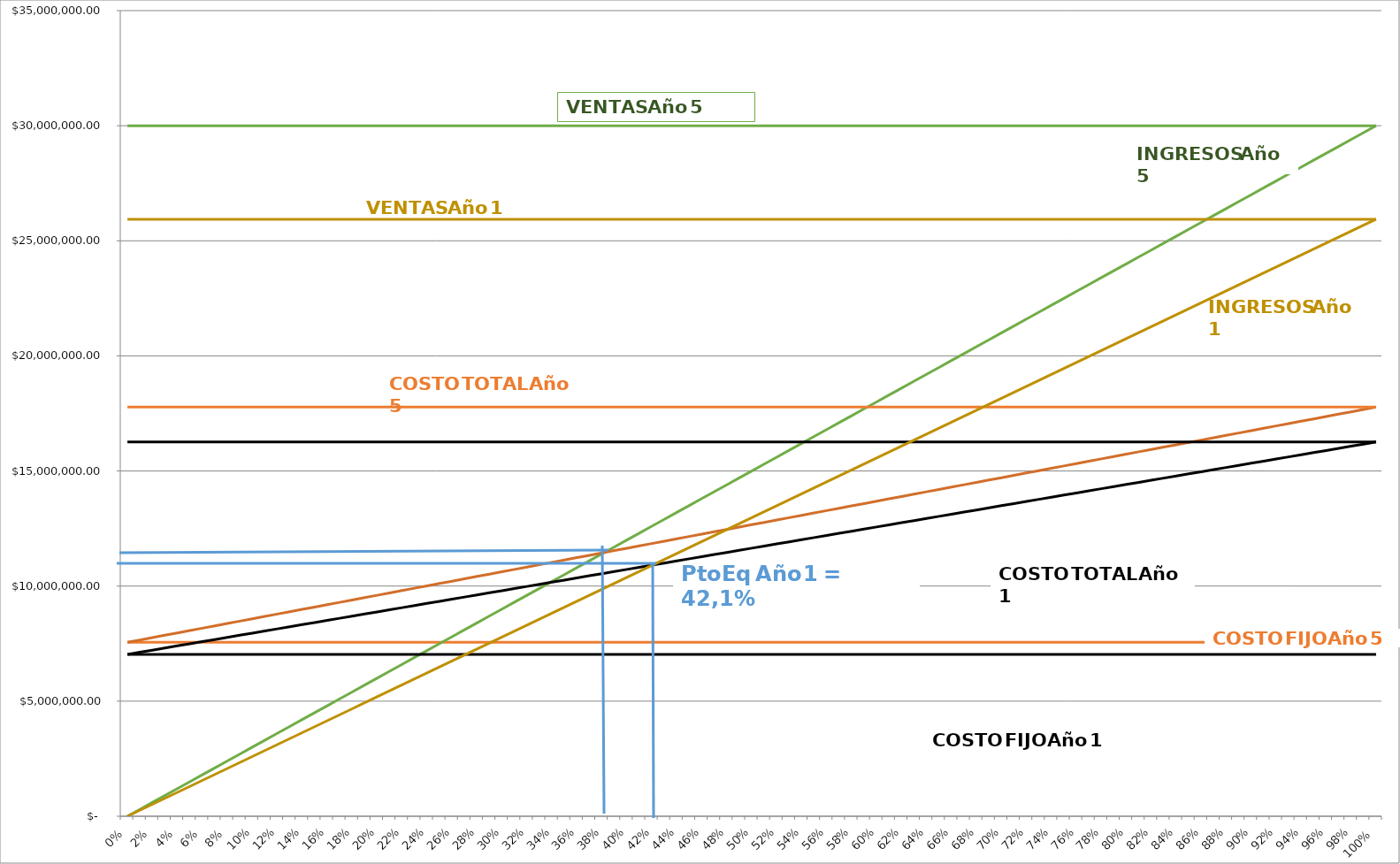
| Category | Ventas Año 5 | CFT Año 5 | Ing Año 5 | CV Año 5 | CT Año 5 | Ventas Año 1 | CFT Año 1 | CV Año 1 | CT Año 1 | Ing Año 1 |
|---|---|---|---|---|---|---|---|---|---|---|
| 0.0 | 30000000 | 7556679.2 | 0 | 7556679.2 | 17773897.792 | 25937500 | 7032367.523 | 7032367.523 | 16259117.051 | 0 |
| 0.01 | 30000000 | 7556679.2 | 300000 | 7658851.386 | 17773897.792 | 25937500 | 7032367.523 | 7124635.019 | 16259117.051 | 259375 |
| 0.02 | 30000000 | 7556679.2 | 600000 | 7761023.572 | 17773897.792 | 25937500 | 7032367.523 | 7216902.514 | 16259117.051 | 518750 |
| 0.03 | 30000000 | 7556679.2 | 900000 | 7863195.758 | 17773897.792 | 25937500 | 7032367.523 | 7309170.009 | 16259117.051 | 778125 |
| 0.04 | 30000000 | 7556679.2 | 1200000 | 7965367.944 | 17773897.792 | 25937500 | 7032367.523 | 7401437.504 | 16259117.051 | 1037500 |
| 0.05 | 30000000 | 7556679.2 | 1500000 | 8067540.13 | 17773897.792 | 25937500 | 7032367.523 | 7493705 | 16259117.051 | 1296875 |
| 0.06 | 30000000 | 7556679.2 | 1800000 | 8169712.316 | 17773897.792 | 25937500 | 7032367.523 | 7585972.495 | 16259117.051 | 1556250 |
| 0.07 | 30000000 | 7556679.2 | 2100000 | 8271884.502 | 17773897.792 | 25937500 | 7032367.523 | 7678239.99 | 16259117.051 | 1815625 |
| 0.08 | 30000000 | 7556679.2 | 2400000 | 8374056.688 | 17773897.792 | 25937500 | 7032367.523 | 7770507.486 | 16259117.051 | 2075000 |
| 0.09 | 30000000 | 7556679.2 | 2700000 | 8476228.874 | 17773897.792 | 25937500 | 7032367.523 | 7862774.981 | 16259117.051 | 2334375 |
| 0.1 | 30000000 | 7556679.2 | 3000000 | 8578401.059 | 17773897.792 | 25937500 | 7032367.523 | 7955042.476 | 16259117.051 | 2593750 |
| 0.11 | 30000000 | 7556679.2 | 3300000 | 8680573.245 | 17773897.792 | 25937500 | 7032367.523 | 8047309.971 | 16259117.051 | 2853125 |
| 0.12 | 30000000 | 7556679.2 | 3600000 | 8782745.431 | 17773897.792 | 25937500 | 7032367.523 | 8139577.467 | 16259117.051 | 3112500 |
| 0.13 | 30000000 | 7556679.2 | 3900000 | 8884917.617 | 17773897.792 | 25937500 | 7032367.523 | 8231844.962 | 16259117.051 | 3371875 |
| 0.14 | 30000000 | 7556679.2 | 4200000 | 8987089.803 | 17773897.792 | 25937500 | 7032367.523 | 8324112.457 | 16259117.051 | 3631250 |
| 0.15 | 30000000 | 7556679.2 | 4500000 | 9089261.989 | 17773897.792 | 25937500 | 7032367.523 | 8416379.952 | 16259117.051 | 3890625 |
| 0.16 | 30000000 | 7556679.2 | 4800000 | 9191434.175 | 17773897.792 | 25937500 | 7032367.523 | 8508647.448 | 16259117.051 | 4150000 |
| 0.17 | 30000000 | 7556679.2 | 5100000 | 9293606.361 | 17773897.792 | 25937500 | 7032367.523 | 8600914.943 | 16259117.051 | 4409375 |
| 0.18 | 30000000 | 7556679.2 | 5400000 | 9395778.547 | 17773897.792 | 25937500 | 7032367.523 | 8693182.438 | 16259117.051 | 4668750 |
| 0.19 | 30000000 | 7556679.2 | 5700000 | 9497950.733 | 17773897.792 | 25937500 | 7032367.523 | 8785449.934 | 16259117.051 | 4928125 |
| 0.2 | 30000000 | 7556679.2 | 6000000 | 9600122.919 | 17773897.792 | 25937500 | 7032367.523 | 8877717.429 | 16259117.051 | 5187500 |
| 0.21 | 30000000 | 7556679.2 | 6300000 | 9702295.105 | 17773897.792 | 25937500 | 7032367.523 | 8969984.924 | 16259117.051 | 5446875 |
| 0.22 | 30000000 | 7556679.2 | 6600000 | 9804467.291 | 17773897.792 | 25937500 | 7032367.523 | 9062252.419 | 16259117.051 | 5706250 |
| 0.23 | 30000000 | 7556679.2 | 6900000 | 9906639.476 | 17773897.792 | 25937500 | 7032367.523 | 9154519.915 | 16259117.051 | 5965625 |
| 0.24 | 30000000 | 7556679.2 | 7200000 | 10008811.662 | 17773897.792 | 25937500 | 7032367.523 | 9246787.41 | 16259117.051 | 6225000 |
| 0.25 | 30000000 | 7556679.2 | 7500000 | 10110983.848 | 17773897.792 | 25937500 | 7032367.523 | 9339054.905 | 16259117.051 | 6484375 |
| 0.26 | 30000000 | 7556679.2 | 7800000 | 10213156.034 | 17773897.792 | 25937500 | 7032367.523 | 9431322.401 | 16259117.051 | 6743750 |
| 0.27 | 30000000 | 7556679.2 | 8100000 | 10315328.22 | 17773897.792 | 25937500 | 7032367.523 | 9523589.896 | 16259117.051 | 7003125 |
| 0.28 | 30000000 | 7556679.2 | 8400000 | 10417500.406 | 17773897.792 | 25937500 | 7032367.523 | 9615857.391 | 16259117.051 | 7262500 |
| 0.29 | 30000000 | 7556679.2 | 8700000 | 10519672.592 | 17773897.792 | 25937500 | 7032367.523 | 9708124.886 | 16259117.051 | 7521875 |
| 0.3 | 30000000 | 7556679.2 | 9000000 | 10621844.778 | 17773897.792 | 25937500 | 7032367.523 | 9800392.382 | 16259117.051 | 7781250 |
| 0.31 | 30000000 | 7556679.2 | 9300000 | 10724016.964 | 17773897.792 | 25937500 | 7032367.523 | 9892659.877 | 16259117.051 | 8040625 |
| 0.32 | 30000000 | 7556679.2 | 9600000 | 10826189.15 | 17773897.792 | 25937500 | 7032367.523 | 9984927.372 | 16259117.051 | 8300000 |
| 0.33 | 30000000 | 7556679.2 | 9900000 | 10928361.336 | 17773897.792 | 25937500 | 7032367.523 | 10077194.867 | 16259117.051 | 8559375 |
| 0.34 | 30000000 | 7556679.2 | 10200000 | 11030533.522 | 17773897.792 | 25937500 | 7032367.523 | 10169462.363 | 16259117.051 | 8818750 |
| 0.35 | 30000000 | 7556679.2 | 10500000 | 11132705.707 | 17773897.792 | 25937500 | 7032367.523 | 10261729.858 | 16259117.051 | 9078125 |
| 0.36 | 30000000 | 7556679.2 | 10800000 | 11234877.893 | 17773897.792 | 25937500 | 7032367.523 | 10353997.353 | 16259117.051 | 9337500 |
| 0.37 | 30000000 | 7556679.2 | 11100000 | 11337050.079 | 17773897.792 | 25937500 | 7032367.523 | 10446264.849 | 16259117.051 | 9596875 |
| 0.38 | 30000000 | 7556679.2 | 11400000 | 11439222.265 | 17773897.792 | 25937500 | 7032367.523 | 10538532.344 | 16259117.051 | 9856250 |
| 0.39 | 30000000 | 7556679.2 | 11700000 | 11541394.451 | 17773897.792 | 25937500 | 7032367.523 | 10630799.839 | 16259117.051 | 10115625 |
| 0.4 | 30000000 | 7556679.2 | 12000000 | 11643566.637 | 17773897.792 | 25937500 | 7032367.523 | 10723067.334 | 16259117.051 | 10375000 |
| 0.41 | 30000000 | 7556679.2 | 12300000 | 11745738.823 | 17773897.792 | 25937500 | 7032367.523 | 10815334.83 | 16259117.051 | 10634375 |
| 0.42 | 30000000 | 7556679.2 | 12600000 | 11847911.009 | 17773897.792 | 25937500 | 7032367.523 | 10907602.325 | 16259117.051 | 10893750 |
| 0.43 | 30000000 | 7556679.2 | 12900000 | 11950083.195 | 17773897.792 | 25937500 | 7032367.523 | 10999869.82 | 16259117.051 | 11153125 |
| 0.44 | 30000000 | 7556679.2 | 13200000 | 12052255.381 | 17773897.792 | 25937500 | 7032367.523 | 11092137.316 | 16259117.051 | 11412500 |
| 0.45 | 30000000 | 7556679.2 | 13500000 | 12154427.567 | 17773897.792 | 25937500 | 7032367.523 | 11184404.811 | 16259117.051 | 11671875 |
| 0.46 | 30000000 | 7556679.2 | 13800000 | 12256599.753 | 17773897.792 | 25937500 | 7032367.523 | 11276672.306 | 16259117.051 | 11931250 |
| 0.47 | 30000000 | 7556679.2 | 14100000 | 12358771.939 | 17773897.792 | 25937500 | 7032367.523 | 11368939.801 | 16259117.051 | 12190625 |
| 0.48 | 30000000 | 7556679.2 | 14400000 | 12460944.124 | 17773897.792 | 25937500 | 7032367.523 | 11461207.297 | 16259117.051 | 12450000 |
| 0.49 | 30000000 | 7556679.2 | 14700000 | 12563116.31 | 17773897.792 | 25937500 | 7032367.523 | 11553474.792 | 16259117.051 | 12709375 |
| 0.5 | 30000000 | 7556679.2 | 15000000 | 12665288.496 | 17773897.792 | 25937500 | 7032367.523 | 11645742.287 | 16259117.051 | 12968750 |
| 0.51 | 30000000 | 7556679.2 | 15300000 | 12767460.682 | 17773897.792 | 25937500 | 7032367.523 | 11738009.782 | 16259117.051 | 13228125 |
| 0.52 | 30000000 | 7556679.2 | 15600000 | 12869632.868 | 17773897.792 | 25937500 | 7032367.523 | 11830277.278 | 16259117.051 | 13487500 |
| 0.53 | 30000000 | 7556679.2 | 15900000 | 12971805.054 | 17773897.792 | 25937500 | 7032367.523 | 11922544.773 | 16259117.051 | 13746875 |
| 0.54 | 30000000 | 7556679.2 | 16200000 | 13073977.24 | 17773897.792 | 25937500 | 7032367.523 | 12014812.268 | 16259117.051 | 14006250 |
| 0.55 | 30000000 | 7556679.2 | 16500000 | 13176149.426 | 17773897.792 | 25937500 | 7032367.523 | 12107079.764 | 16259117.051 | 14265625 |
| 0.56 | 30000000 | 7556679.2 | 16800000 | 13278321.612 | 17773897.792 | 25937500 | 7032367.523 | 12199347.259 | 16259117.051 | 14525000 |
| 0.57 | 30000000 | 7556679.2 | 17100000 | 13380493.798 | 17773897.792 | 25937500 | 7032367.523 | 12291614.754 | 16259117.051 | 14784375 |
| 0.58 | 30000000 | 7556679.2 | 17400000 | 13482665.984 | 17773897.792 | 25937500 | 7032367.523 | 12383882.249 | 16259117.051 | 15043750 |
| 0.59 | 30000000 | 7556679.2 | 17700000 | 13584838.17 | 17773897.792 | 25937500 | 7032367.523 | 12476149.745 | 16259117.051 | 15303125 |
| 0.6 | 30000000 | 7556679.2 | 18000000 | 13687010.355 | 17773897.792 | 25937500 | 7032367.523 | 12568417.24 | 16259117.051 | 15562500 |
| 0.61 | 30000000 | 7556679.2 | 18300000 | 13789182.541 | 17773897.792 | 25937500 | 7032367.523 | 12660684.735 | 16259117.051 | 15821875 |
| 0.62 | 30000000 | 7556679.2 | 18600000 | 13891354.727 | 17773897.792 | 25937500 | 7032367.523 | 12752952.231 | 16259117.051 | 16081250 |
| 0.63 | 30000000 | 7556679.2 | 18900000 | 13993526.913 | 17773897.792 | 25937500 | 7032367.523 | 12845219.726 | 16259117.051 | 16340625 |
| 0.64 | 30000000 | 7556679.2 | 19200000 | 14095699.099 | 17773897.792 | 25937500 | 7032367.523 | 12937487.221 | 16259117.051 | 16600000 |
| 0.65 | 30000000 | 7556679.2 | 19500000 | 14197871.285 | 17773897.792 | 25937500 | 7032367.523 | 13029754.716 | 16259117.051 | 16859375 |
| 0.66 | 30000000 | 7556679.2 | 19800000 | 14300043.471 | 17773897.792 | 25937500 | 7032367.523 | 13122022.212 | 16259117.051 | 17118750 |
| 0.67 | 30000000 | 7556679.2 | 20100000 | 14402215.657 | 17773897.792 | 25937500 | 7032367.523 | 13214289.707 | 16259117.051 | 17378125 |
| 0.68 | 30000000 | 7556679.2 | 20400000 | 14504387.843 | 17773897.792 | 25937500 | 7032367.523 | 13306557.202 | 16259117.051 | 17637500 |
| 0.69 | 30000000 | 7556679.2 | 20700000 | 14606560.029 | 17773897.792 | 25937500 | 7032367.523 | 13398824.697 | 16259117.051 | 17896875 |
| 0.7 | 30000000 | 7556679.2 | 21000000 | 14708732.215 | 17773897.792 | 25937500 | 7032367.523 | 13491092.193 | 16259117.051 | 18156250 |
| 0.71 | 30000000 | 7556679.2 | 21300000 | 14810904.401 | 17773897.792 | 25937500 | 7032367.523 | 13583359.688 | 16259117.051 | 18415625 |
| 0.72 | 30000000 | 7556679.2 | 21600000 | 14913076.587 | 17773897.792 | 25937500 | 7032367.523 | 13675627.183 | 16259117.051 | 18675000 |
| 0.73 | 30000000 | 7556679.2 | 21900000 | 15015248.772 | 17773897.792 | 25937500 | 7032367.523 | 13767894.679 | 16259117.051 | 18934375 |
| 0.74 | 30000000 | 7556679.2 | 22200000 | 15117420.958 | 17773897.792 | 25937500 | 7032367.523 | 13860162.174 | 16259117.051 | 19193750 |
| 0.75 | 30000000 | 7556679.2 | 22500000 | 15219593.144 | 17773897.792 | 25937500 | 7032367.523 | 13952429.669 | 16259117.051 | 19453125 |
| 0.76 | 30000000 | 7556679.2 | 22800000 | 15321765.33 | 17773897.792 | 25937500 | 7032367.523 | 14044697.164 | 16259117.051 | 19712500 |
| 0.77 | 30000000 | 7556679.2 | 23100000 | 15423937.516 | 17773897.792 | 25937500 | 7032367.523 | 14136964.66 | 16259117.051 | 19971875 |
| 0.78 | 30000000 | 7556679.2 | 23400000 | 15526109.702 | 17773897.792 | 25937500 | 7032367.523 | 14229232.155 | 16259117.051 | 20231250 |
| 0.79 | 30000000 | 7556679.2 | 23700000 | 15628281.888 | 17773897.792 | 25937500 | 7032367.523 | 14321499.65 | 16259117.051 | 20490625 |
| 0.8 | 30000000 | 7556679.2 | 24000000 | 15730454.074 | 17773897.792 | 25937500 | 7032367.523 | 14413767.146 | 16259117.051 | 20750000 |
| 0.81 | 30000000 | 7556679.2 | 24300000 | 15832626.26 | 17773897.792 | 25937500 | 7032367.523 | 14506034.641 | 16259117.051 | 21009375 |
| 0.82 | 30000000 | 7556679.2 | 24600000 | 15934798.446 | 17773897.792 | 25937500 | 7032367.523 | 14598302.136 | 16259117.051 | 21268750 |
| 0.83 | 30000000 | 7556679.2 | 24900000 | 16036970.632 | 17773897.792 | 25937500 | 7032367.523 | 14690569.631 | 16259117.051 | 21528125 |
| 0.84 | 30000000 | 7556679.2 | 25200000 | 16139142.818 | 17773897.792 | 25937500 | 7032367.523 | 14782837.127 | 16259117.051 | 21787500 |
| 0.85 | 30000000 | 7556679.2 | 25500000 | 16241315.003 | 17773897.792 | 25937500 | 7032367.523 | 14875104.622 | 16259117.051 | 22046875 |
| 0.86 | 30000000 | 7556679.2 | 25800000 | 16343487.189 | 17773897.792 | 25937500 | 7032367.523 | 14967372.117 | 16259117.051 | 22306250 |
| 0.87 | 30000000 | 7556679.2 | 26100000 | 16445659.375 | 17773897.792 | 25937500 | 7032367.523 | 15059639.612 | 16259117.051 | 22565625 |
| 0.88 | 30000000 | 7556679.2 | 26400000 | 16547831.561 | 17773897.792 | 25937500 | 7032367.523 | 15151907.108 | 16259117.051 | 22825000 |
| 0.89 | 30000000 | 7556679.2 | 26700000 | 16650003.747 | 17773897.792 | 25937500 | 7032367.523 | 15244174.603 | 16259117.051 | 23084375 |
| 0.9 | 30000000 | 7556679.2 | 27000000 | 16752175.933 | 17773897.792 | 25937500 | 7032367.523 | 15336442.098 | 16259117.051 | 23343750 |
| 0.91 | 30000000 | 7556679.2 | 27300000 | 16854348.119 | 17773897.792 | 25937500 | 7032367.523 | 15428709.594 | 16259117.051 | 23603125 |
| 0.92 | 30000000 | 7556679.2 | 27600000 | 16956520.305 | 17773897.792 | 25937500 | 7032367.523 | 15520977.089 | 16259117.051 | 23862500 |
| 0.93 | 30000000 | 7556679.2 | 27900000 | 17058692.491 | 17773897.792 | 25937500 | 7032367.523 | 15613244.584 | 16259117.051 | 24121875 |
| 0.94 | 30000000 | 7556679.2 | 28200000 | 17160864.677 | 17773897.792 | 25937500 | 7032367.523 | 15705512.079 | 16259117.051 | 24381250 |
| 0.95 | 30000000 | 7556679.2 | 28500000 | 17263036.863 | 17773897.792 | 25937500 | 7032367.523 | 15797779.575 | 16259117.051 | 24640625 |
| 0.96 | 30000000 | 7556679.2 | 28800000 | 17365209.049 | 17773897.792 | 25937500 | 7032367.523 | 15890047.07 | 16259117.051 | 24900000 |
| 0.97 | 30000000 | 7556679.2 | 29100000 | 17467381.235 | 17773897.792 | 25937500 | 7032367.523 | 15982314.565 | 16259117.051 | 25159375 |
| 0.98 | 30000000 | 7556679.2 | 29400000 | 17569553.42 | 17773897.792 | 25937500 | 7032367.523 | 16074582.061 | 16259117.051 | 25418750 |
| 0.99 | 30000000 | 7556679.2 | 29700000 | 17671725.606 | 17773897.792 | 25937500 | 7032367.523 | 16166849.556 | 16259117.051 | 25678125 |
| 1.0 | 30000000 | 7556679.2 | 30000000 | 17773897.792 | 17773897.792 | 25937500 | 7032367.523 | 16259117.051 | 16259117.051 | 25937500 |